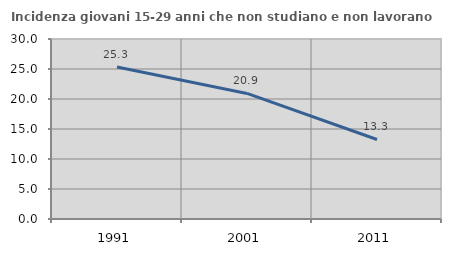
| Category | Incidenza giovani 15-29 anni che non studiano e non lavorano  |
|---|---|
| 1991.0 | 25.318 |
| 2001.0 | 20.93 |
| 2011.0 | 13.253 |